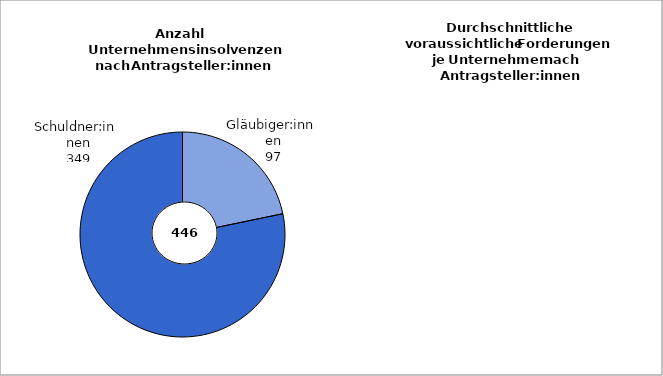
| Category | Series 0 |
|---|---|
| Gläubiger:innen | 97 |
| Schuldner:innen | 349 |